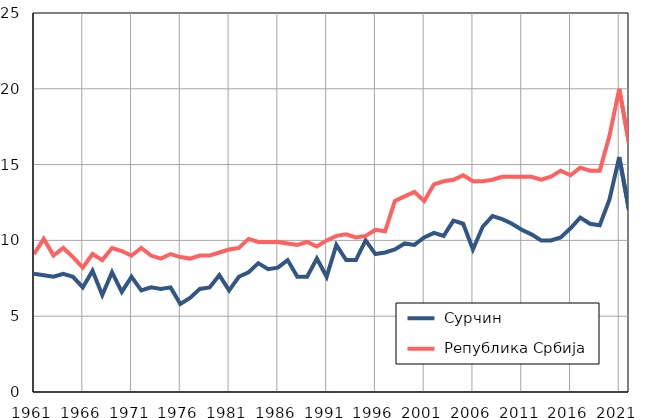
| Category |  Сурчин |  Република Србија |
|---|---|---|
| 1961.0 | 7.8 | 9.1 |
| 1962.0 | 7.7 | 10.1 |
| 1963.0 | 7.6 | 9 |
| 1964.0 | 7.8 | 9.5 |
| 1965.0 | 7.6 | 8.9 |
| 1966.0 | 6.9 | 8.2 |
| 1967.0 | 8 | 9.1 |
| 1968.0 | 6.4 | 8.7 |
| 1969.0 | 7.9 | 9.5 |
| 1970.0 | 6.6 | 9.3 |
| 1971.0 | 7.6 | 9 |
| 1972.0 | 6.7 | 9.5 |
| 1973.0 | 6.9 | 9 |
| 1974.0 | 6.8 | 8.8 |
| 1975.0 | 6.9 | 9.1 |
| 1976.0 | 5.8 | 8.9 |
| 1977.0 | 6.2 | 8.8 |
| 1978.0 | 6.8 | 9 |
| 1979.0 | 6.9 | 9 |
| 1980.0 | 7.7 | 9.2 |
| 1981.0 | 6.7 | 9.4 |
| 1982.0 | 7.6 | 9.5 |
| 1983.0 | 7.9 | 10.1 |
| 1984.0 | 8.5 | 9.9 |
| 1985.0 | 8.1 | 9.9 |
| 1986.0 | 8.2 | 9.9 |
| 1987.0 | 8.7 | 9.8 |
| 1988.0 | 7.6 | 9.7 |
| 1989.0 | 7.6 | 9.9 |
| 1990.0 | 8.8 | 9.6 |
| 1991.0 | 7.6 | 10 |
| 1992.0 | 9.7 | 10.3 |
| 1993.0 | 8.7 | 10.4 |
| 1994.0 | 8.7 | 10.2 |
| 1995.0 | 10 | 10.3 |
| 1996.0 | 9.1 | 10.7 |
| 1997.0 | 9.2 | 10.6 |
| 1998.0 | 9.4 | 12.6 |
| 1999.0 | 9.8 | 12.9 |
| 2000.0 | 9.7 | 13.2 |
| 2001.0 | 10.2 | 12.6 |
| 2002.0 | 10.5 | 13.7 |
| 2003.0 | 10.3 | 13.9 |
| 2004.0 | 11.3 | 14 |
| 2005.0 | 11.1 | 14.3 |
| 2006.0 | 9.4 | 13.9 |
| 2007.0 | 10.9 | 13.9 |
| 2008.0 | 11.6 | 14 |
| 2009.0 | 11.4 | 14.2 |
| 2010.0 | 11.1 | 14.2 |
| 2011.0 | 10.7 | 14.2 |
| 2012.0 | 10.4 | 14.2 |
| 2013.0 | 10 | 14 |
| 2014.0 | 10 | 14.2 |
| 2015.0 | 10.2 | 14.6 |
| 2016.0 | 10.8 | 14.3 |
| 2017.0 | 11.5 | 14.8 |
| 2018.0 | 11.1 | 14.6 |
| 2019.0 | 11 | 14.6 |
| 2020.0 | 12.7 | 16.9 |
| 2021.0 | 15.5 | 20 |
| 2022.0 | 12 | 16.4 |